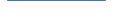
| Category | Series 0 |
|---|---|
| 0 | 332.664 |
| 1 | 297.11 |
| 2 | 244.886 |
| 3 | 216.54 |
| 4 | 261.841 |
| 5 | 262 |
| 6 | 284 |
| 7 | 321 |
| 8 | 283 |